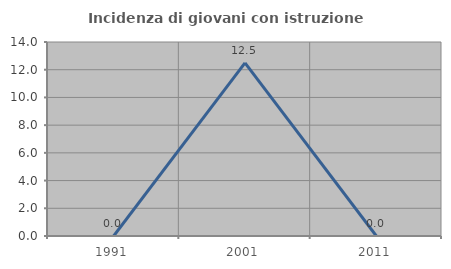
| Category | Incidenza di giovani con istruzione universitaria |
|---|---|
| 1991.0 | 0 |
| 2001.0 | 12.5 |
| 2011.0 | 0 |